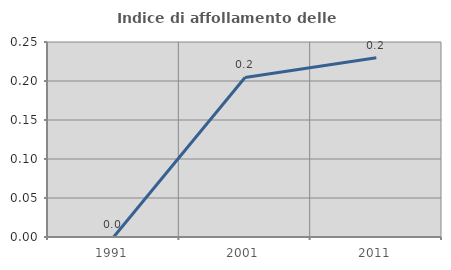
| Category | Indice di affollamento delle abitazioni  |
|---|---|
| 1991.0 | 0 |
| 2001.0 | 0.204 |
| 2011.0 | 0.23 |